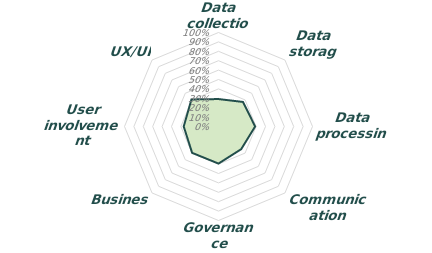
| Category | Series 0 |
|---|---|
| Data collection | 0.292 |
| Data storage | 0.369 |
| Data processing | 0.39 |
| Communication | 0.341 |
| Governance | 0.394 |
| Business | 0.397 |
| User involvement | 0.37 |
| UX/UI | 0.407 |